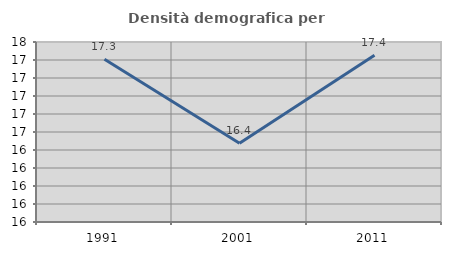
| Category | Densità demografica |
|---|---|
| 1991.0 | 17.307 |
| 2001.0 | 16.375 |
| 2011.0 | 17.352 |